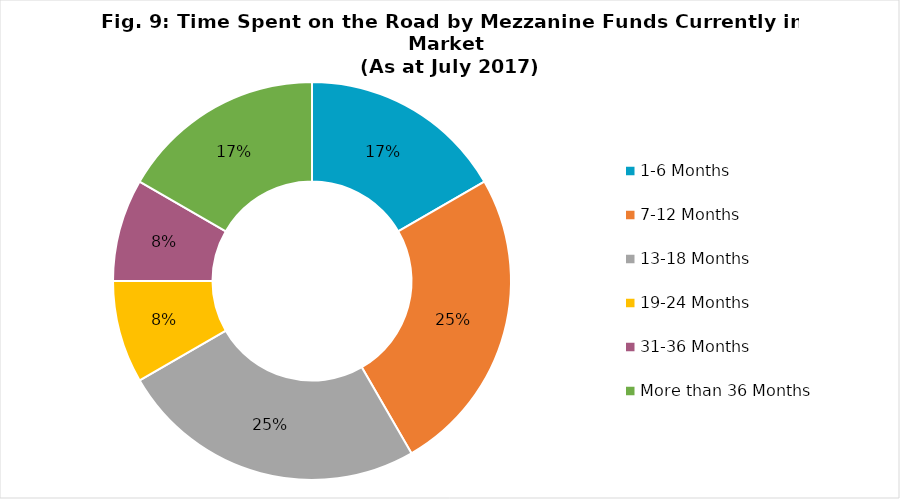
| Category | Proportion of Funds in Market |
|---|---|
| 1-6 Months | 16.67 |
| 7-12 Months | 25 |
| 13-18 Months | 25 |
| 19-24 Months | 8.33 |
| 31-36 Months | 8.33 |
| More than 36 Months | 16.67 |